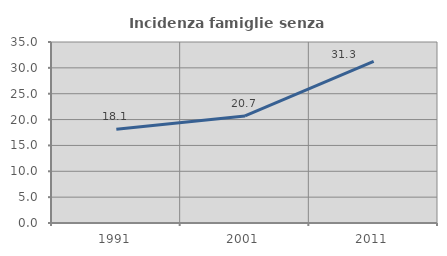
| Category | Incidenza famiglie senza nuclei |
|---|---|
| 1991.0 | 18.134 |
| 2001.0 | 20.711 |
| 2011.0 | 31.255 |